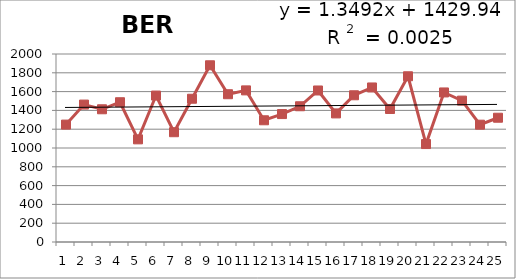
| Category | 1988-2012 |
|---|---|
| 0 | 1249 |
| 1 | 1462 |
| 2 | 1412 |
| 3 | 1487 |
| 4 | 1092 |
| 5 | 1558 |
| 6 | 1168 |
| 7 | 1524 |
| 8 | 1880 |
| 9 | 1572 |
| 10 | 1613 |
| 11 | 1295 |
| 12 | 1361 |
| 13 | 1444 |
| 14 | 1612 |
| 15 | 1368 |
| 16 | 1561 |
| 17 | 1644 |
| 18 | 1415 |
| 19 | 1763 |
| 20 | 1042 |
| 21 | 1591 |
| 22 | 1504 |
| 23 | 1248 |
| 24 | 1322 |